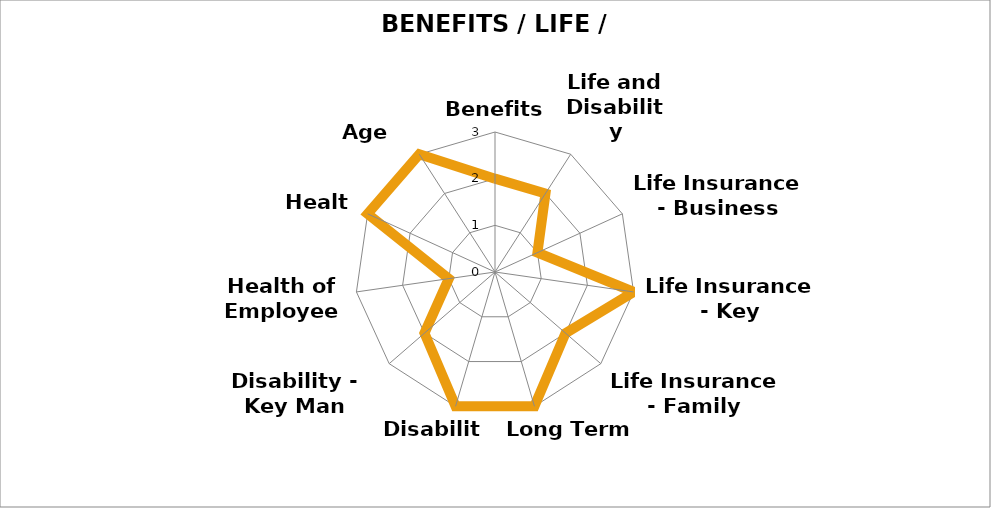
| Category | Series 0 |
|---|---|
| Benefits Options | 2 |
| Life and Disability Analysis | 2 |
| Life Insurance - Business | 1 |
| Life Insurance - Key Employee | 3 |
| Life Insurance - Family | 2 |
| Long Term Care | 3 |
| Disability | 3 |
| Disability - Key Man | 2 |
| Health of Employees | 1 |
| Health | 3 |
| Age Timing | 3 |